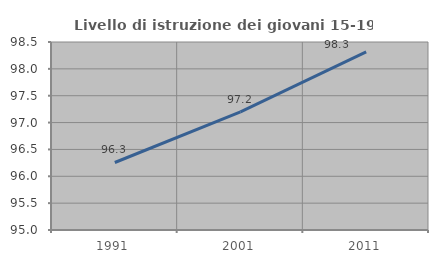
| Category | Livello di istruzione dei giovani 15-19 anni |
|---|---|
| 1991.0 | 96.257 |
| 2001.0 | 97.2 |
| 2011.0 | 98.315 |